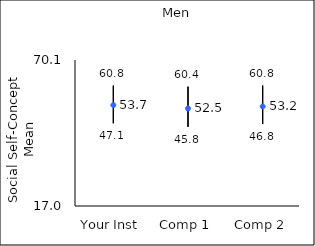
| Category | 25th percentile | 75th percentile | Mean |
|---|---|---|---|
| Your Inst | 47.1 | 60.8 | 53.69 |
| Comp 1 | 45.8 | 60.4 | 52.48 |
| Comp 2 | 46.8 | 60.8 | 53.2 |